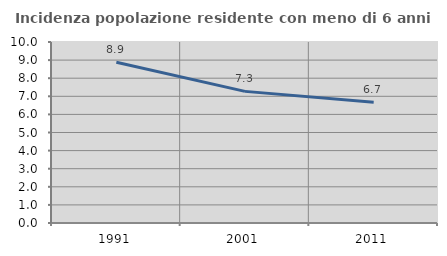
| Category | Incidenza popolazione residente con meno di 6 anni |
|---|---|
| 1991.0 | 8.886 |
| 2001.0 | 7.272 |
| 2011.0 | 6.675 |